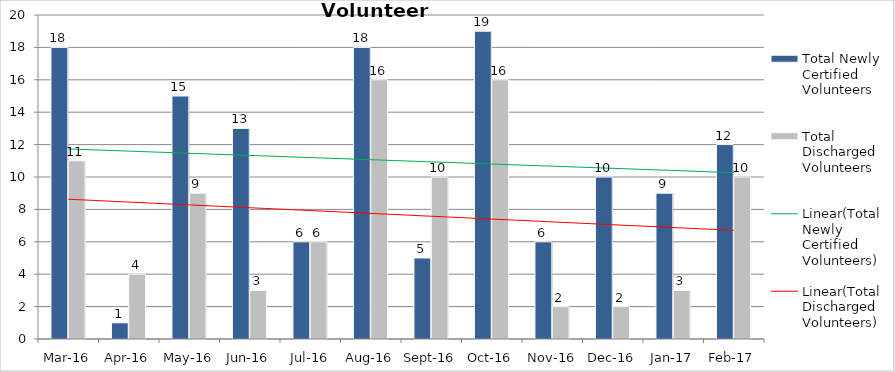
| Category | Total Newly Certified Volunteers | Total Discharged Volunteers |
|---|---|---|
| Mar-16 | 18 | 11 |
| Apr-16 | 1 | 4 |
| May-16 | 15 | 9 |
| Jun-16 | 13 | 3 |
| Jul-16 | 6 | 6 |
| Aug-16 | 18 | 16 |
| Sep-16 | 5 | 10 |
| Oct-16 | 19 | 16 |
| Nov-16 | 6 | 2 |
| Dec-16 | 10 | 2 |
| Jan-17 | 9 | 3 |
| Feb-17 | 12 | 10 |